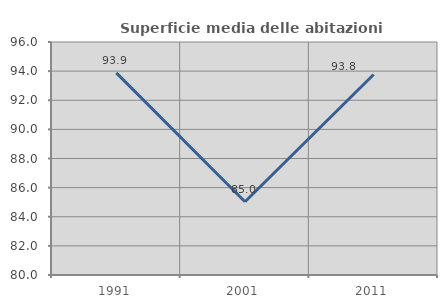
| Category | Superficie media delle abitazioni occupate |
|---|---|
| 1991.0 | 93.876 |
| 2001.0 | 85.031 |
| 2011.0 | 93.771 |